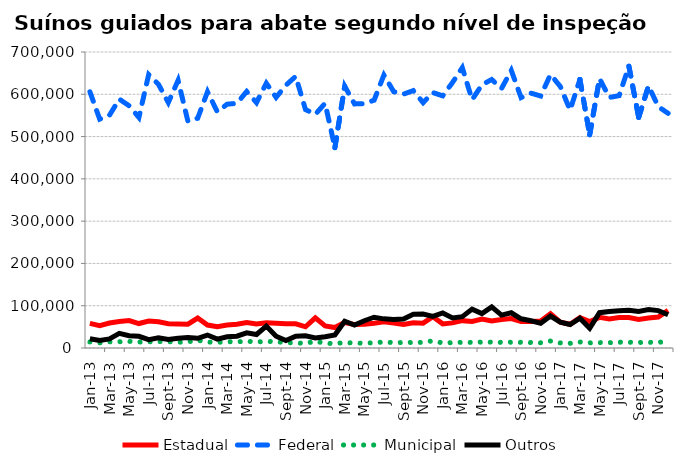
| Category | Estadual | Federal | Municipal | Outros |
|---|---|---|---|---|
| 2013-01-01 | 58101 | 605877 | 14306 | 21934 |
| 2013-02-01 | 52712 | 541190 | 12135 | 17706 |
| 2013-03-01 | 58973 | 550577 | 14568 | 21488 |
| 2013-04-01 | 62718 | 588572 | 14808 | 34578 |
| 2013-05-01 | 64906 | 572808 | 15764 | 28898 |
| 2013-06-01 | 57849 | 545138 | 13976 | 27639 |
| 2013-07-01 | 63907 | 646684 | 14621 | 19696 |
| 2013-08-01 | 61923 | 623331 | 15186 | 24350 |
| 2013-09-01 | 57455 | 580422 | 14970 | 19934 |
| 2013-10-01 | 57047 | 633004 | 13531 | 23157 |
| 2013-11-01 | 56299 | 536382 | 14738 | 24634 |
| 2013-12-01 | 70908 | 543358 | 18309 | 23051 |
| 2014-01-01 | 54217 | 606043 | 14069 | 30591 |
| 2014-02-01 | 50171 | 558586 | 13377 | 20920 |
| 2014-03-01 | 54539 | 576548 | 14655 | 26465 |
| 2014-04-01 | 56367 | 578666 | 14626 | 27938 |
| 2014-05-01 | 60427 | 606644 | 16002 | 36000 |
| 2014-06-01 | 56999 | 580144 | 14317 | 31903 |
| 2014-07-01 | 59733 | 626232 | 15568 | 51819 |
| 2014-08-01 | 58787 | 592630 | 15174 | 27954 |
| 2014-09-01 | 57378 | 621476 | 12145 | 17517 |
| 2014-10-01 | 57340 | 642403 | 12274 | 27988 |
| 2014-11-01 | 50213 | 563938 | 10735 | 28829 |
| 2014-12-01 | 71228 | 552576 | 16014 | 23878 |
| 2015-01-01 | 52402 | 578619 | 11101 | 26572 |
| 2015-02-01 | 48327 | 473777 | 10457 | 30657 |
| 2015-03-01 | 60430 | 619027 | 12911 | 63223 |
| 2015-04-01 | 55322 | 577251 | 11696 | 54338 |
| 2015-05-01 | 56316 | 577767 | 11365 | 64391 |
| 2015-06-01 | 58665 | 585979 | 12480 | 72789 |
| 2015-07-01 | 61843 | 645409 | 14163 | 68948 |
| 2015-08-01 | 58789 | 606192 | 12695 | 67505 |
| 2015-09-01 | 55487 | 600353 | 12877 | 68770 |
| 2015-10-01 | 59547 | 608721 | 13078 | 79930 |
| 2015-11-01 | 58673 | 580229 | 13151 | 80153 |
| 2015-12-01 | 74041 | 603995 | 17081 | 74653 |
| 2016-01-01 | 57050 | 596305 | 11814 | 82827 |
| 2016-02-01 | 59448 | 627834 | 12707 | 71110 |
| 2016-03-01 | 64706 | 662873 | 13384 | 74077 |
| 2016-04-01 | 62834 | 587124 | 13210 | 91976 |
| 2016-05-01 | 68404 | 622384 | 13975 | 81279 |
| 2016-06-01 | 64141 | 634928 | 13864 | 97101 |
| 2016-07-01 | 67488 | 613559 | 13320 | 77893 |
| 2016-08-01 | 69764 | 656481 | 13595 | 83325 |
| 2016-09-01 | 62839 | 592140 | 13452 | 68999 |
| 2016-10-01 | 62891 | 602733 | 12950 | 64407 |
| 2016-11-01 | 63967 | 595900 | 12389 | 58430 |
| 2016-12-01 | 81018 | 646672 | 16520 | 75626 |
| 2017-01-01 | 61267 | 618528 | 12063 | 61177 |
| 2017-02-01 | 56187 | 562510 | 11028 | 55519 |
| 2017-03-01 | 71849 | 635097 | 14116 | 70365 |
| 2017-04-01 | 62589 | 504241 | 12235 | 46731 |
| 2017-05-01 | 72453 | 637216 | 12818 | 83518 |
| 2017-06-01 | 68431 | 592496 | 12620 | 86325 |
| 2017-07-01 | 72029 | 596736 | 13610 | 87853 |
| 2017-08-01 | 72069 | 666395 | 13570 | 89153 |
| 2017-09-01 | 67503 | 545119 | 13040 | 86525 |
| 2017-10-01 | 71094 | 619868 | 13441 | 90978 |
| 2017-11-01 | 73328 | 570746 | 13044 | 88363 |
| 2017-12-01 | 88990 | 554942 | 16745 | 78551 |